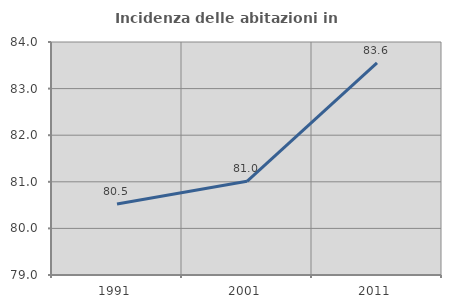
| Category | Incidenza delle abitazioni in proprietà  |
|---|---|
| 1991.0 | 80.524 |
| 2001.0 | 81.011 |
| 2011.0 | 83.55 |